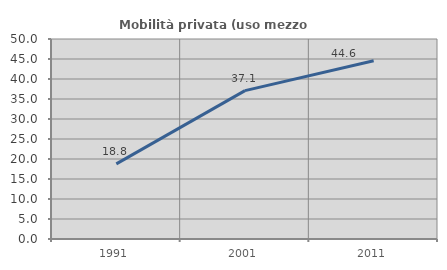
| Category | Mobilità privata (uso mezzo privato) |
|---|---|
| 1991.0 | 18.773 |
| 2001.0 | 37.093 |
| 2011.0 | 44.562 |